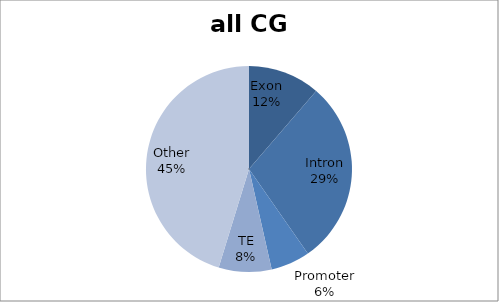
| Category | all CG |
|---|---|
| Exon | 1134622 |
| Intron | 2912003 |
| Promoter | 616140 |
| TE | 832569 |
| Other | 4540367 |